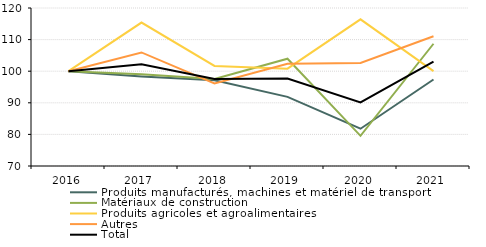
| Category | Produits manufacturés, machines et matériel de transport | Matériaux de construction | Produits agricoles et agroalimentaires | Autres | Total |
|---|---|---|---|---|---|
| 2016 | 100 | 100 | 100 | 100 | 100 |
| 2017 | 98.361 | 99.069 | 115.395 | 105.939 | 102.205 |
| 2018 | 97.138 | 97.57 | 101.668 | 96.138 | 97.509 |
| 2019 | 91.879 | 103.949 | 100.804 | 102.382 | 97.675 |
| 2020 | 81.802 | 79.553 | 116.415 | 102.615 | 90.15 |
| 2021 | 97.359 | 108.687 | 100.043 | 111.042 | 103.03 |